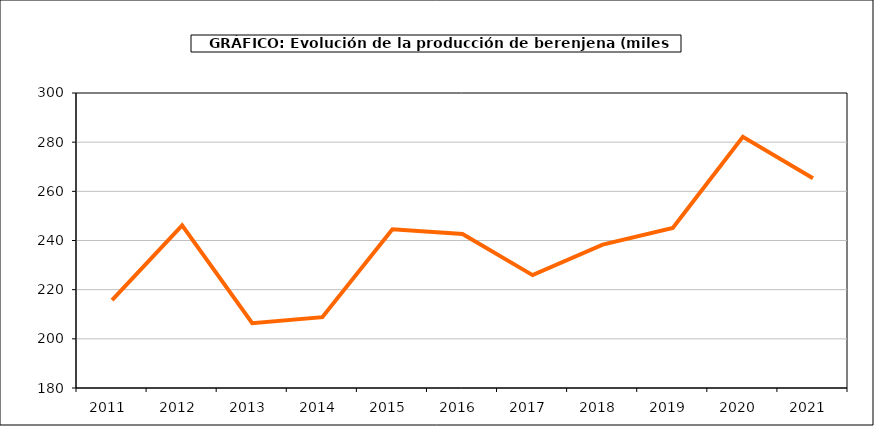
| Category | producción |
|---|---|
| 2011.0 | 215.769 |
| 2012.0 | 246.142 |
| 2013.0 | 206.333 |
| 2014.0 | 208.821 |
| 2015.0 | 244.54 |
| 2016.0 | 242.643 |
| 2017.0 | 225.912 |
| 2018.0 | 238.325 |
| 2019.0 | 245.146 |
| 2020.0 | 282.2 |
| 2021.0 | 265.294 |